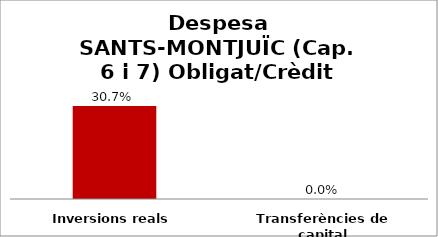
| Category | Series 0 |
|---|---|
| Inversions reals | 0.307 |
| Transferències de capital | 0 |